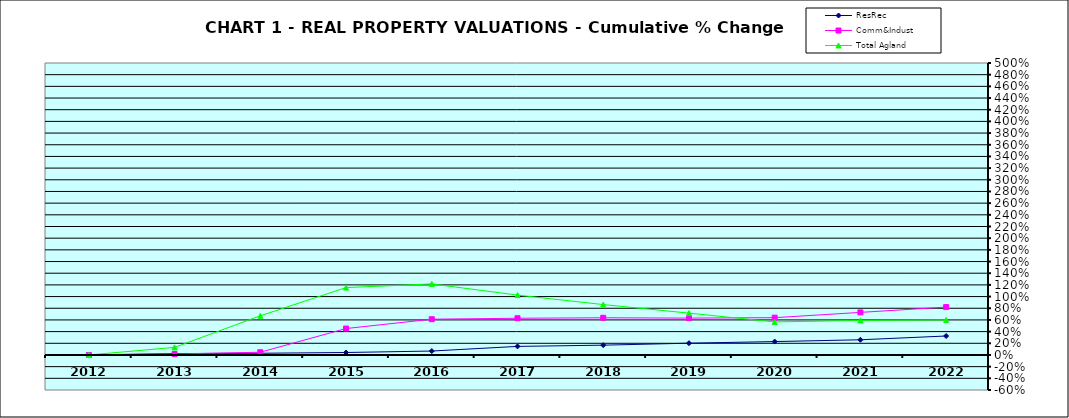
| Category | ResRec | Comm&Indust | Total Agland |
|---|---|---|---|
| 2012.0 | 0 | 0 | 0 |
| 2013.0 | 0.024 | 0.017 | 0.13 |
| 2014.0 | 0.029 | 0.047 | 0.671 |
| 2015.0 | 0.042 | 0.452 | 1.154 |
| 2016.0 | 0.067 | 0.612 | 1.216 |
| 2017.0 | 0.147 | 0.629 | 1.025 |
| 2018.0 | 0.168 | 0.637 | 0.863 |
| 2019.0 | 0.201 | 0.631 | 0.716 |
| 2020.0 | 0.229 | 0.639 | 0.566 |
| 2021.0 | 0.26 | 0.729 | 0.591 |
| 2022.0 | 0.325 | 0.82 | 0.6 |